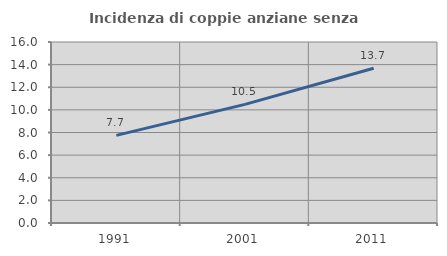
| Category | Incidenza di coppie anziane senza figli  |
|---|---|
| 1991.0 | 7.747 |
| 2001.0 | 10.485 |
| 2011.0 | 13.683 |